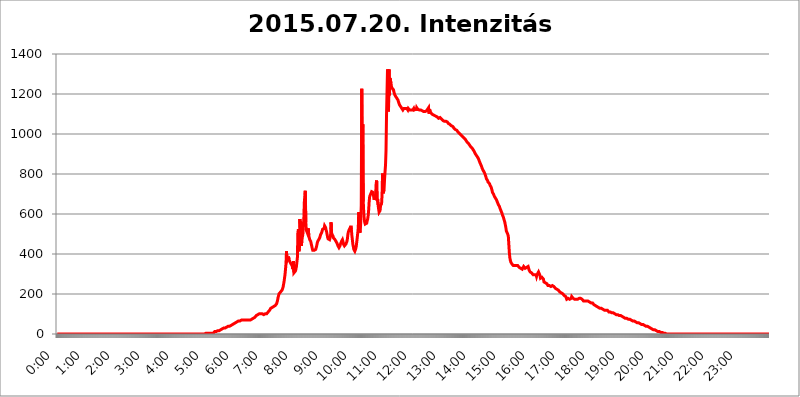
| Category | 2015.07.20. Intenzitás [W/m^2] |
|---|---|
| 0.0 | 0 |
| 0.0006944444444444445 | 0 |
| 0.001388888888888889 | 0 |
| 0.0020833333333333333 | 0 |
| 0.002777777777777778 | 0 |
| 0.003472222222222222 | 0 |
| 0.004166666666666667 | 0 |
| 0.004861111111111111 | 0 |
| 0.005555555555555556 | 0 |
| 0.0062499999999999995 | 0 |
| 0.006944444444444444 | 0 |
| 0.007638888888888889 | 0 |
| 0.008333333333333333 | 0 |
| 0.009027777777777779 | 0 |
| 0.009722222222222222 | 0 |
| 0.010416666666666666 | 0 |
| 0.011111111111111112 | 0 |
| 0.011805555555555555 | 0 |
| 0.012499999999999999 | 0 |
| 0.013194444444444444 | 0 |
| 0.013888888888888888 | 0 |
| 0.014583333333333332 | 0 |
| 0.015277777777777777 | 0 |
| 0.015972222222222224 | 0 |
| 0.016666666666666666 | 0 |
| 0.017361111111111112 | 0 |
| 0.018055555555555557 | 0 |
| 0.01875 | 0 |
| 0.019444444444444445 | 0 |
| 0.02013888888888889 | 0 |
| 0.020833333333333332 | 0 |
| 0.02152777777777778 | 0 |
| 0.022222222222222223 | 0 |
| 0.02291666666666667 | 0 |
| 0.02361111111111111 | 0 |
| 0.024305555555555556 | 0 |
| 0.024999999999999998 | 0 |
| 0.025694444444444447 | 0 |
| 0.02638888888888889 | 0 |
| 0.027083333333333334 | 0 |
| 0.027777777777777776 | 0 |
| 0.02847222222222222 | 0 |
| 0.029166666666666664 | 0 |
| 0.029861111111111113 | 0 |
| 0.030555555555555555 | 0 |
| 0.03125 | 0 |
| 0.03194444444444445 | 0 |
| 0.03263888888888889 | 0 |
| 0.03333333333333333 | 0 |
| 0.034027777777777775 | 0 |
| 0.034722222222222224 | 0 |
| 0.035416666666666666 | 0 |
| 0.036111111111111115 | 0 |
| 0.03680555555555556 | 0 |
| 0.0375 | 0 |
| 0.03819444444444444 | 0 |
| 0.03888888888888889 | 0 |
| 0.03958333333333333 | 0 |
| 0.04027777777777778 | 0 |
| 0.04097222222222222 | 0 |
| 0.041666666666666664 | 0 |
| 0.042361111111111106 | 0 |
| 0.04305555555555556 | 0 |
| 0.043750000000000004 | 0 |
| 0.044444444444444446 | 0 |
| 0.04513888888888889 | 0 |
| 0.04583333333333334 | 0 |
| 0.04652777777777778 | 0 |
| 0.04722222222222222 | 0 |
| 0.04791666666666666 | 0 |
| 0.04861111111111111 | 0 |
| 0.049305555555555554 | 0 |
| 0.049999999999999996 | 0 |
| 0.05069444444444445 | 0 |
| 0.051388888888888894 | 0 |
| 0.052083333333333336 | 0 |
| 0.05277777777777778 | 0 |
| 0.05347222222222222 | 0 |
| 0.05416666666666667 | 0 |
| 0.05486111111111111 | 0 |
| 0.05555555555555555 | 0 |
| 0.05625 | 0 |
| 0.05694444444444444 | 0 |
| 0.057638888888888885 | 0 |
| 0.05833333333333333 | 0 |
| 0.05902777777777778 | 0 |
| 0.059722222222222225 | 0 |
| 0.06041666666666667 | 0 |
| 0.061111111111111116 | 0 |
| 0.06180555555555556 | 0 |
| 0.0625 | 0 |
| 0.06319444444444444 | 0 |
| 0.06388888888888888 | 0 |
| 0.06458333333333334 | 0 |
| 0.06527777777777778 | 0 |
| 0.06597222222222222 | 0 |
| 0.06666666666666667 | 0 |
| 0.06736111111111111 | 0 |
| 0.06805555555555555 | 0 |
| 0.06874999999999999 | 0 |
| 0.06944444444444443 | 0 |
| 0.07013888888888889 | 0 |
| 0.07083333333333333 | 0 |
| 0.07152777777777779 | 0 |
| 0.07222222222222223 | 0 |
| 0.07291666666666667 | 0 |
| 0.07361111111111111 | 0 |
| 0.07430555555555556 | 0 |
| 0.075 | 0 |
| 0.07569444444444444 | 0 |
| 0.0763888888888889 | 0 |
| 0.07708333333333334 | 0 |
| 0.07777777777777778 | 0 |
| 0.07847222222222222 | 0 |
| 0.07916666666666666 | 0 |
| 0.0798611111111111 | 0 |
| 0.08055555555555556 | 0 |
| 0.08125 | 0 |
| 0.08194444444444444 | 0 |
| 0.08263888888888889 | 0 |
| 0.08333333333333333 | 0 |
| 0.08402777777777777 | 0 |
| 0.08472222222222221 | 0 |
| 0.08541666666666665 | 0 |
| 0.08611111111111112 | 0 |
| 0.08680555555555557 | 0 |
| 0.08750000000000001 | 0 |
| 0.08819444444444445 | 0 |
| 0.08888888888888889 | 0 |
| 0.08958333333333333 | 0 |
| 0.09027777777777778 | 0 |
| 0.09097222222222222 | 0 |
| 0.09166666666666667 | 0 |
| 0.09236111111111112 | 0 |
| 0.09305555555555556 | 0 |
| 0.09375 | 0 |
| 0.09444444444444444 | 0 |
| 0.09513888888888888 | 0 |
| 0.09583333333333333 | 0 |
| 0.09652777777777777 | 0 |
| 0.09722222222222222 | 0 |
| 0.09791666666666667 | 0 |
| 0.09861111111111111 | 0 |
| 0.09930555555555555 | 0 |
| 0.09999999999999999 | 0 |
| 0.10069444444444443 | 0 |
| 0.1013888888888889 | 0 |
| 0.10208333333333335 | 0 |
| 0.10277777777777779 | 0 |
| 0.10347222222222223 | 0 |
| 0.10416666666666667 | 0 |
| 0.10486111111111111 | 0 |
| 0.10555555555555556 | 0 |
| 0.10625 | 0 |
| 0.10694444444444444 | 0 |
| 0.1076388888888889 | 0 |
| 0.10833333333333334 | 0 |
| 0.10902777777777778 | 0 |
| 0.10972222222222222 | 0 |
| 0.1111111111111111 | 0 |
| 0.11180555555555556 | 0 |
| 0.11180555555555556 | 0 |
| 0.1125 | 0 |
| 0.11319444444444444 | 0 |
| 0.11388888888888889 | 0 |
| 0.11458333333333333 | 0 |
| 0.11527777777777777 | 0 |
| 0.11597222222222221 | 0 |
| 0.11666666666666665 | 0 |
| 0.1173611111111111 | 0 |
| 0.11805555555555557 | 0 |
| 0.11944444444444445 | 0 |
| 0.12013888888888889 | 0 |
| 0.12083333333333333 | 0 |
| 0.12152777777777778 | 0 |
| 0.12222222222222223 | 0 |
| 0.12291666666666667 | 0 |
| 0.12291666666666667 | 0 |
| 0.12361111111111112 | 0 |
| 0.12430555555555556 | 0 |
| 0.125 | 0 |
| 0.12569444444444444 | 0 |
| 0.12638888888888888 | 0 |
| 0.12708333333333333 | 0 |
| 0.16875 | 0 |
| 0.12847222222222224 | 0 |
| 0.12916666666666668 | 0 |
| 0.12986111111111112 | 0 |
| 0.13055555555555556 | 0 |
| 0.13125 | 0 |
| 0.13194444444444445 | 0 |
| 0.1326388888888889 | 0 |
| 0.13333333333333333 | 0 |
| 0.13402777777777777 | 0 |
| 0.13402777777777777 | 0 |
| 0.13472222222222222 | 0 |
| 0.13541666666666666 | 0 |
| 0.1361111111111111 | 0 |
| 0.13749999999999998 | 0 |
| 0.13819444444444443 | 0 |
| 0.1388888888888889 | 0 |
| 0.13958333333333334 | 0 |
| 0.14027777777777778 | 0 |
| 0.14097222222222222 | 0 |
| 0.14166666666666666 | 0 |
| 0.1423611111111111 | 0 |
| 0.14305555555555557 | 0 |
| 0.14375000000000002 | 0 |
| 0.14444444444444446 | 0 |
| 0.1451388888888889 | 0 |
| 0.1451388888888889 | 0 |
| 0.14652777777777778 | 0 |
| 0.14722222222222223 | 0 |
| 0.14791666666666667 | 0 |
| 0.1486111111111111 | 0 |
| 0.14930555555555555 | 0 |
| 0.15 | 0 |
| 0.15069444444444444 | 0 |
| 0.15138888888888888 | 0 |
| 0.15208333333333332 | 0 |
| 0.15277777777777776 | 0 |
| 0.15347222222222223 | 0 |
| 0.15416666666666667 | 0 |
| 0.15486111111111112 | 0 |
| 0.15555555555555556 | 0 |
| 0.15625 | 0 |
| 0.15694444444444444 | 0 |
| 0.15763888888888888 | 0 |
| 0.15833333333333333 | 0 |
| 0.15902777777777777 | 0 |
| 0.15972222222222224 | 0 |
| 0.16041666666666668 | 0 |
| 0.16111111111111112 | 0 |
| 0.16180555555555556 | 0 |
| 0.1625 | 0 |
| 0.16319444444444445 | 0 |
| 0.1638888888888889 | 0 |
| 0.16458333333333333 | 0 |
| 0.16527777777777777 | 0 |
| 0.16597222222222222 | 0 |
| 0.16666666666666666 | 0 |
| 0.1673611111111111 | 0 |
| 0.16805555555555554 | 0 |
| 0.16874999999999998 | 0 |
| 0.16944444444444443 | 0 |
| 0.17013888888888887 | 0 |
| 0.1708333333333333 | 0 |
| 0.17152777777777775 | 0 |
| 0.17222222222222225 | 0 |
| 0.1729166666666667 | 0 |
| 0.17361111111111113 | 0 |
| 0.17430555555555557 | 0 |
| 0.17500000000000002 | 0 |
| 0.17569444444444446 | 0 |
| 0.1763888888888889 | 0 |
| 0.17708333333333334 | 0 |
| 0.17777777777777778 | 0 |
| 0.17847222222222223 | 0 |
| 0.17916666666666667 | 0 |
| 0.1798611111111111 | 0 |
| 0.18055555555555555 | 0 |
| 0.18125 | 0 |
| 0.18194444444444444 | 0 |
| 0.1826388888888889 | 0 |
| 0.18333333333333335 | 0 |
| 0.1840277777777778 | 0 |
| 0.18472222222222223 | 0 |
| 0.18541666666666667 | 0 |
| 0.18611111111111112 | 0 |
| 0.18680555555555556 | 0 |
| 0.1875 | 0 |
| 0.18819444444444444 | 0 |
| 0.18888888888888888 | 0 |
| 0.18958333333333333 | 0 |
| 0.19027777777777777 | 0 |
| 0.1909722222222222 | 0 |
| 0.19166666666666665 | 0 |
| 0.19236111111111112 | 0 |
| 0.19305555555555554 | 0 |
| 0.19375 | 0 |
| 0.19444444444444445 | 0 |
| 0.1951388888888889 | 0 |
| 0.19583333333333333 | 0 |
| 0.19652777777777777 | 0 |
| 0.19722222222222222 | 0 |
| 0.19791666666666666 | 0 |
| 0.1986111111111111 | 0 |
| 0.19930555555555554 | 0 |
| 0.19999999999999998 | 0 |
| 0.20069444444444443 | 0 |
| 0.20138888888888887 | 0 |
| 0.2020833333333333 | 0 |
| 0.2027777777777778 | 0 |
| 0.2034722222222222 | 0 |
| 0.2041666666666667 | 0 |
| 0.20486111111111113 | 0 |
| 0.20555555555555557 | 0 |
| 0.20625000000000002 | 0 |
| 0.20694444444444446 | 0 |
| 0.2076388888888889 | 0 |
| 0.20833333333333334 | 3.525 |
| 0.20902777777777778 | 0 |
| 0.20972222222222223 | 3.525 |
| 0.21041666666666667 | 3.525 |
| 0.2111111111111111 | 3.525 |
| 0.21180555555555555 | 3.525 |
| 0.2125 | 3.525 |
| 0.21319444444444444 | 3.525 |
| 0.2138888888888889 | 3.525 |
| 0.21458333333333335 | 3.525 |
| 0.2152777777777778 | 3.525 |
| 0.21597222222222223 | 3.525 |
| 0.21666666666666667 | 3.525 |
| 0.21736111111111112 | 3.525 |
| 0.21805555555555556 | 3.525 |
| 0.21875 | 3.525 |
| 0.21944444444444444 | 7.887 |
| 0.22013888888888888 | 7.887 |
| 0.22083333333333333 | 12.257 |
| 0.22152777777777777 | 12.257 |
| 0.2222222222222222 | 12.257 |
| 0.22291666666666665 | 12.257 |
| 0.2236111111111111 | 12.257 |
| 0.22430555555555556 | 16.636 |
| 0.225 | 16.636 |
| 0.22569444444444445 | 16.636 |
| 0.2263888888888889 | 16.636 |
| 0.22708333333333333 | 16.636 |
| 0.22777777777777777 | 21.024 |
| 0.22847222222222222 | 21.024 |
| 0.22916666666666666 | 21.024 |
| 0.2298611111111111 | 21.024 |
| 0.23055555555555554 | 21.024 |
| 0.23124999999999998 | 25.419 |
| 0.23194444444444443 | 25.419 |
| 0.23263888888888887 | 29.823 |
| 0.2333333333333333 | 29.823 |
| 0.2340277777777778 | 29.823 |
| 0.2347222222222222 | 29.823 |
| 0.2354166666666667 | 29.823 |
| 0.23611111111111113 | 29.823 |
| 0.23680555555555557 | 29.823 |
| 0.23750000000000002 | 34.234 |
| 0.23819444444444446 | 34.234 |
| 0.2388888888888889 | 34.234 |
| 0.23958333333333334 | 38.653 |
| 0.24027777777777778 | 38.653 |
| 0.24097222222222223 | 38.653 |
| 0.24166666666666667 | 38.653 |
| 0.2423611111111111 | 43.079 |
| 0.24305555555555555 | 43.079 |
| 0.24375 | 43.079 |
| 0.24444444444444446 | 47.511 |
| 0.24513888888888888 | 47.511 |
| 0.24583333333333335 | 47.511 |
| 0.2465277777777778 | 51.951 |
| 0.24722222222222223 | 51.951 |
| 0.24791666666666667 | 51.951 |
| 0.24861111111111112 | 56.398 |
| 0.24930555555555556 | 56.398 |
| 0.25 | 56.398 |
| 0.25069444444444444 | 60.85 |
| 0.2513888888888889 | 60.85 |
| 0.2520833333333333 | 60.85 |
| 0.25277777777777777 | 60.85 |
| 0.2534722222222222 | 65.31 |
| 0.25416666666666665 | 65.31 |
| 0.2548611111111111 | 65.31 |
| 0.2555555555555556 | 65.31 |
| 0.25625000000000003 | 65.31 |
| 0.2569444444444445 | 69.775 |
| 0.2576388888888889 | 69.775 |
| 0.25833333333333336 | 69.775 |
| 0.2590277777777778 | 69.775 |
| 0.25972222222222224 | 69.775 |
| 0.2604166666666667 | 69.775 |
| 0.2611111111111111 | 69.775 |
| 0.26180555555555557 | 69.775 |
| 0.2625 | 69.775 |
| 0.26319444444444445 | 69.775 |
| 0.2638888888888889 | 69.775 |
| 0.26458333333333334 | 69.775 |
| 0.2652777777777778 | 69.775 |
| 0.2659722222222222 | 69.775 |
| 0.26666666666666666 | 69.775 |
| 0.2673611111111111 | 69.775 |
| 0.26805555555555555 | 69.775 |
| 0.26875 | 69.775 |
| 0.26944444444444443 | 69.775 |
| 0.2701388888888889 | 69.775 |
| 0.2708333333333333 | 69.775 |
| 0.27152777777777776 | 69.775 |
| 0.2722222222222222 | 74.246 |
| 0.27291666666666664 | 74.246 |
| 0.2736111111111111 | 74.246 |
| 0.2743055555555555 | 74.246 |
| 0.27499999999999997 | 78.722 |
| 0.27569444444444446 | 83.205 |
| 0.27638888888888885 | 83.205 |
| 0.27708333333333335 | 83.205 |
| 0.2777777777777778 | 87.692 |
| 0.27847222222222223 | 87.692 |
| 0.2791666666666667 | 92.184 |
| 0.2798611111111111 | 92.184 |
| 0.28055555555555556 | 96.682 |
| 0.28125 | 96.682 |
| 0.28194444444444444 | 96.682 |
| 0.2826388888888889 | 101.184 |
| 0.2833333333333333 | 101.184 |
| 0.28402777777777777 | 101.184 |
| 0.2847222222222222 | 101.184 |
| 0.28541666666666665 | 101.184 |
| 0.28611111111111115 | 101.184 |
| 0.28680555555555554 | 101.184 |
| 0.28750000000000003 | 101.184 |
| 0.2881944444444445 | 101.184 |
| 0.2888888888888889 | 101.184 |
| 0.28958333333333336 | 96.682 |
| 0.2902777777777778 | 96.682 |
| 0.29097222222222224 | 101.184 |
| 0.2916666666666667 | 101.184 |
| 0.2923611111111111 | 101.184 |
| 0.29305555555555557 | 101.184 |
| 0.29375 | 101.184 |
| 0.29444444444444445 | 101.184 |
| 0.2951388888888889 | 105.69 |
| 0.29583333333333334 | 110.201 |
| 0.2965277777777778 | 110.201 |
| 0.2972222222222222 | 114.716 |
| 0.29791666666666666 | 119.235 |
| 0.2986111111111111 | 123.758 |
| 0.29930555555555555 | 128.284 |
| 0.3 | 128.284 |
| 0.30069444444444443 | 128.284 |
| 0.3013888888888889 | 132.814 |
| 0.3020833333333333 | 132.814 |
| 0.30277777777777776 | 132.814 |
| 0.3034722222222222 | 137.347 |
| 0.30416666666666664 | 137.347 |
| 0.3048611111111111 | 137.347 |
| 0.3055555555555555 | 141.884 |
| 0.30624999999999997 | 141.884 |
| 0.3069444444444444 | 146.423 |
| 0.3076388888888889 | 150.964 |
| 0.30833333333333335 | 160.056 |
| 0.3090277777777778 | 169.156 |
| 0.30972222222222223 | 182.82 |
| 0.3104166666666667 | 191.937 |
| 0.3111111111111111 | 201.058 |
| 0.31180555555555556 | 201.058 |
| 0.3125 | 205.62 |
| 0.31319444444444444 | 210.182 |
| 0.3138888888888889 | 210.182 |
| 0.3145833333333333 | 214.746 |
| 0.31527777777777777 | 219.309 |
| 0.3159722222222222 | 223.873 |
| 0.31666666666666665 | 233 |
| 0.31736111111111115 | 246.689 |
| 0.31805555555555554 | 260.373 |
| 0.31875000000000003 | 278.603 |
| 0.3194444444444445 | 296.808 |
| 0.3201388888888889 | 324.052 |
| 0.32083333333333336 | 351.198 |
| 0.3215277777777778 | 414.035 |
| 0.32222222222222224 | 364.728 |
| 0.3229166666666667 | 369.23 |
| 0.3236111111111111 | 373.729 |
| 0.32430555555555557 | 387.202 |
| 0.325 | 373.729 |
| 0.32569444444444445 | 369.23 |
| 0.3263888888888889 | 360.221 |
| 0.32708333333333334 | 355.712 |
| 0.3277777777777778 | 351.198 |
| 0.3284722222222222 | 346.682 |
| 0.32916666666666666 | 342.162 |
| 0.3298611111111111 | 351.198 |
| 0.33055555555555555 | 324.052 |
| 0.33125 | 364.728 |
| 0.33194444444444443 | 305.898 |
| 0.3326388888888889 | 305.898 |
| 0.3333333333333333 | 305.898 |
| 0.3340277777777778 | 314.98 |
| 0.3347222222222222 | 324.052 |
| 0.3354166666666667 | 337.639 |
| 0.3361111111111111 | 360.221 |
| 0.3368055555555556 | 382.715 |
| 0.33749999999999997 | 506.542 |
| 0.33819444444444446 | 523.88 |
| 0.33888888888888885 | 414.035 |
| 0.33958333333333335 | 427.39 |
| 0.34027777777777773 | 575.299 |
| 0.34097222222222223 | 532.513 |
| 0.3416666666666666 | 562.53 |
| 0.3423611111111111 | 440.702 |
| 0.3430555555555555 | 467.187 |
| 0.34375 | 484.735 |
| 0.3444444444444445 | 497.836 |
| 0.3451388888888889 | 532.513 |
| 0.3458333333333334 | 575.299 |
| 0.34652777777777777 | 658.909 |
| 0.34722222222222227 | 658.909 |
| 0.34791666666666665 | 715.858 |
| 0.34861111111111115 | 558.261 |
| 0.34930555555555554 | 519.555 |
| 0.35000000000000003 | 515.223 |
| 0.3506944444444444 | 506.542 |
| 0.3513888888888889 | 502.192 |
| 0.3520833333333333 | 528.2 |
| 0.3527777777777778 | 493.475 |
| 0.3534722222222222 | 480.356 |
| 0.3541666666666667 | 471.582 |
| 0.3548611111111111 | 471.582 |
| 0.35555555555555557 | 462.786 |
| 0.35625 | 449.551 |
| 0.35694444444444445 | 440.702 |
| 0.3576388888888889 | 427.39 |
| 0.35833333333333334 | 418.492 |
| 0.3590277777777778 | 418.492 |
| 0.3597222222222222 | 418.492 |
| 0.36041666666666666 | 418.492 |
| 0.3611111111111111 | 414.035 |
| 0.36180555555555555 | 418.492 |
| 0.3625 | 422.943 |
| 0.36319444444444443 | 431.833 |
| 0.3638888888888889 | 440.702 |
| 0.3645833333333333 | 453.968 |
| 0.3652777777777778 | 462.786 |
| 0.3659722222222222 | 467.187 |
| 0.3666666666666667 | 471.582 |
| 0.3673611111111111 | 471.582 |
| 0.3680555555555556 | 480.356 |
| 0.36874999999999997 | 489.108 |
| 0.36944444444444446 | 497.836 |
| 0.37013888888888885 | 502.192 |
| 0.37083333333333335 | 506.542 |
| 0.37152777777777773 | 515.223 |
| 0.37222222222222223 | 523.88 |
| 0.3729166666666666 | 523.88 |
| 0.3736111111111111 | 523.88 |
| 0.3743055555555555 | 528.2 |
| 0.375 | 541.121 |
| 0.3756944444444445 | 541.121 |
| 0.3763888888888889 | 532.513 |
| 0.3770833333333334 | 519.555 |
| 0.37777777777777777 | 510.885 |
| 0.37847222222222227 | 497.836 |
| 0.37916666666666665 | 484.735 |
| 0.37986111111111115 | 475.972 |
| 0.38055555555555554 | 475.972 |
| 0.38125000000000003 | 471.582 |
| 0.3819444444444444 | 471.582 |
| 0.3826388888888889 | 480.356 |
| 0.3833333333333333 | 489.108 |
| 0.3840277777777778 | 558.261 |
| 0.3847222222222222 | 506.542 |
| 0.3854166666666667 | 497.836 |
| 0.3861111111111111 | 502.192 |
| 0.38680555555555557 | 489.108 |
| 0.3875 | 480.356 |
| 0.38819444444444445 | 480.356 |
| 0.3888888888888889 | 475.972 |
| 0.38958333333333334 | 471.582 |
| 0.3902777777777778 | 467.187 |
| 0.3909722222222222 | 462.786 |
| 0.39166666666666666 | 458.38 |
| 0.3923611111111111 | 453.968 |
| 0.39305555555555555 | 449.551 |
| 0.39375 | 440.702 |
| 0.39444444444444443 | 436.27 |
| 0.3951388888888889 | 431.833 |
| 0.3958333333333333 | 436.27 |
| 0.3965277777777778 | 440.702 |
| 0.3972222222222222 | 449.551 |
| 0.3979166666666667 | 453.968 |
| 0.3986111111111111 | 462.786 |
| 0.3993055555555556 | 467.187 |
| 0.39999999999999997 | 471.582 |
| 0.40069444444444446 | 462.786 |
| 0.40138888888888885 | 449.551 |
| 0.40208333333333335 | 445.129 |
| 0.40277777777777773 | 440.702 |
| 0.40347222222222223 | 440.702 |
| 0.4041666666666666 | 445.129 |
| 0.4048611111111111 | 449.551 |
| 0.4055555555555555 | 453.968 |
| 0.40625 | 462.786 |
| 0.4069444444444445 | 475.972 |
| 0.4076388888888889 | 497.836 |
| 0.4083333333333334 | 510.885 |
| 0.40902777777777777 | 515.223 |
| 0.40972222222222227 | 523.88 |
| 0.41041666666666665 | 528.2 |
| 0.41111111111111115 | 532.513 |
| 0.41180555555555554 | 541.121 |
| 0.41250000000000003 | 523.88 |
| 0.4131944444444444 | 493.475 |
| 0.4138888888888889 | 471.582 |
| 0.4145833333333333 | 449.551 |
| 0.4152777777777778 | 436.27 |
| 0.4159722222222222 | 422.943 |
| 0.4166666666666667 | 418.492 |
| 0.4173611111111111 | 414.035 |
| 0.41805555555555557 | 418.492 |
| 0.41875 | 427.39 |
| 0.41944444444444445 | 440.702 |
| 0.4201388888888889 | 462.786 |
| 0.42083333333333334 | 484.735 |
| 0.4215277777777778 | 506.542 |
| 0.4222222222222222 | 532.513 |
| 0.42291666666666666 | 609.062 |
| 0.4236111111111111 | 549.704 |
| 0.42430555555555555 | 506.542 |
| 0.425 | 515.223 |
| 0.42569444444444443 | 562.53 |
| 0.4263888888888889 | 642.4 |
| 0.4270833333333333 | 1225.859 |
| 0.4277777777777778 | 771.559 |
| 0.4284722222222222 | 1048.508 |
| 0.4291666666666667 | 663.019 |
| 0.4298611111111111 | 609.062 |
| 0.4305555555555556 | 575.299 |
| 0.43124999999999997 | 558.261 |
| 0.43194444444444446 | 549.704 |
| 0.43263888888888885 | 545.416 |
| 0.43333333333333335 | 545.416 |
| 0.43402777777777773 | 553.986 |
| 0.43472222222222223 | 566.793 |
| 0.4354166666666666 | 575.299 |
| 0.4361111111111111 | 592.233 |
| 0.4368055555555555 | 621.613 |
| 0.4375 | 663.019 |
| 0.4381944444444445 | 687.544 |
| 0.4388888888888889 | 691.608 |
| 0.4395833333333334 | 699.717 |
| 0.44027777777777777 | 703.762 |
| 0.44097222222222227 | 711.832 |
| 0.44166666666666665 | 707.8 |
| 0.44236111111111115 | 711.832 |
| 0.44305555555555554 | 707.8 |
| 0.44375000000000003 | 687.544 |
| 0.4444444444444444 | 671.22 |
| 0.4451388888888889 | 667.123 |
| 0.4458333333333333 | 675.311 |
| 0.4465277777777778 | 695.666 |
| 0.4472222222222222 | 747.834 |
| 0.4479166666666667 | 767.62 |
| 0.4486111111111111 | 667.123 |
| 0.44930555555555557 | 675.311 |
| 0.45 | 646.537 |
| 0.45069444444444445 | 625.784 |
| 0.4513888888888889 | 609.062 |
| 0.45208333333333334 | 604.864 |
| 0.4527777777777778 | 617.436 |
| 0.4534722222222222 | 642.4 |
| 0.45416666666666666 | 638.256 |
| 0.4548611111111111 | 650.667 |
| 0.45555555555555555 | 695.666 |
| 0.45625 | 802.868 |
| 0.45694444444444443 | 703.762 |
| 0.4576388888888889 | 707.8 |
| 0.4583333333333333 | 719.877 |
| 0.4590277777777778 | 771.559 |
| 0.4597222222222222 | 810.641 |
| 0.4604166666666667 | 845.365 |
| 0.4611111111111111 | 917.534 |
| 0.4618055555555556 | 1089.873 |
| 0.46249999999999997 | 1089.873 |
| 0.46319444444444446 | 1322.082 |
| 0.46388888888888885 | 1158.689 |
| 0.46458333333333335 | 1112.618 |
| 0.46527777777777773 | 1322.082 |
| 0.46597222222222223 | 1193.918 |
| 0.4666666666666666 | 1279.334 |
| 0.4673611111111111 | 1275.142 |
| 0.4680555555555555 | 1254.387 |
| 0.46875 | 1238.014 |
| 0.4694444444444445 | 1229.899 |
| 0.4701388888888889 | 1225.859 |
| 0.4708333333333334 | 1225.859 |
| 0.47152777777777777 | 1221.83 |
| 0.47222222222222227 | 1209.807 |
| 0.47291666666666665 | 1201.843 |
| 0.47361111111111115 | 1193.918 |
| 0.47430555555555554 | 1189.969 |
| 0.47500000000000003 | 1186.03 |
| 0.4756944444444444 | 1182.099 |
| 0.4763888888888889 | 1178.177 |
| 0.4770833333333333 | 1174.263 |
| 0.4777777777777778 | 1170.358 |
| 0.4784722222222222 | 1162.571 |
| 0.4791666666666667 | 1154.814 |
| 0.4798611111111111 | 1147.086 |
| 0.48055555555555557 | 1147.086 |
| 0.48125 | 1139.384 |
| 0.48194444444444445 | 1139.384 |
| 0.4826388888888889 | 1131.708 |
| 0.48333333333333334 | 1131.708 |
| 0.4840277777777778 | 1127.879 |
| 0.4847222222222222 | 1120.238 |
| 0.48541666666666666 | 1124.056 |
| 0.4861111111111111 | 1127.879 |
| 0.48680555555555555 | 1127.879 |
| 0.4875 | 1124.056 |
| 0.48819444444444443 | 1127.879 |
| 0.4888888888888889 | 1127.879 |
| 0.4895833333333333 | 1131.708 |
| 0.4902777777777778 | 1127.879 |
| 0.4909722222222222 | 1124.056 |
| 0.4916666666666667 | 1120.238 |
| 0.4923611111111111 | 1127.879 |
| 0.4930555555555556 | 1124.056 |
| 0.49374999999999997 | 1124.056 |
| 0.49444444444444446 | 1120.238 |
| 0.49513888888888885 | 1124.056 |
| 0.49583333333333335 | 1120.238 |
| 0.49652777777777773 | 1120.238 |
| 0.49722222222222223 | 1124.056 |
| 0.4979166666666666 | 1124.056 |
| 0.4986111111111111 | 1120.238 |
| 0.4993055555555555 | 1124.056 |
| 0.5 | 1127.879 |
| 0.5006944444444444 | 1120.238 |
| 0.5013888888888889 | 1124.056 |
| 0.5020833333333333 | 1124.056 |
| 0.5027777777777778 | 1124.056 |
| 0.5034722222222222 | 1116.426 |
| 0.5041666666666667 | 1131.708 |
| 0.5048611111111111 | 1127.879 |
| 0.5055555555555555 | 1124.056 |
| 0.50625 | 1124.056 |
| 0.5069444444444444 | 1120.238 |
| 0.5076388888888889 | 1120.238 |
| 0.5083333333333333 | 1120.238 |
| 0.5090277777777777 | 1116.426 |
| 0.5097222222222222 | 1120.238 |
| 0.5104166666666666 | 1116.426 |
| 0.5111111111111112 | 1116.426 |
| 0.5118055555555555 | 1116.426 |
| 0.5125000000000001 | 1112.618 |
| 0.5131944444444444 | 1112.618 |
| 0.513888888888889 | 1112.618 |
| 0.5145833333333333 | 1112.618 |
| 0.5152777777777778 | 1112.618 |
| 0.5159722222222222 | 1112.618 |
| 0.5166666666666667 | 1112.618 |
| 0.517361111111111 | 1112.618 |
| 0.5180555555555556 | 1116.426 |
| 0.5187499999999999 | 1120.238 |
| 0.5194444444444445 | 1124.056 |
| 0.5201388888888888 | 1124.056 |
| 0.5208333333333334 | 1131.708 |
| 0.5215277777777778 | 1101.226 |
| 0.5222222222222223 | 1124.056 |
| 0.5229166666666667 | 1112.618 |
| 0.5236111111111111 | 1108.816 |
| 0.5243055555555556 | 1105.019 |
| 0.525 | 1101.226 |
| 0.5256944444444445 | 1101.226 |
| 0.5263888888888889 | 1097.437 |
| 0.5270833333333333 | 1093.653 |
| 0.5277777777777778 | 1093.653 |
| 0.5284722222222222 | 1093.653 |
| 0.5291666666666667 | 1093.653 |
| 0.5298611111111111 | 1093.653 |
| 0.5305555555555556 | 1089.873 |
| 0.53125 | 1089.873 |
| 0.5319444444444444 | 1086.097 |
| 0.5326388888888889 | 1086.097 |
| 0.5333333333333333 | 1082.324 |
| 0.5340277777777778 | 1082.324 |
| 0.5347222222222222 | 1078.555 |
| 0.5354166666666667 | 1078.555 |
| 0.5361111111111111 | 1082.324 |
| 0.5368055555555555 | 1082.324 |
| 0.5375 | 1078.555 |
| 0.5381944444444444 | 1078.555 |
| 0.5388888888888889 | 1074.789 |
| 0.5395833333333333 | 1071.027 |
| 0.5402777777777777 | 1071.027 |
| 0.5409722222222222 | 1067.267 |
| 0.5416666666666666 | 1067.267 |
| 0.5423611111111112 | 1063.51 |
| 0.5430555555555555 | 1063.51 |
| 0.5437500000000001 | 1063.51 |
| 0.5444444444444444 | 1063.51 |
| 0.545138888888889 | 1063.51 |
| 0.5458333333333333 | 1063.51 |
| 0.5465277777777778 | 1063.51 |
| 0.5472222222222222 | 1059.756 |
| 0.5479166666666667 | 1056.004 |
| 0.548611111111111 | 1052.255 |
| 0.5493055555555556 | 1052.255 |
| 0.5499999999999999 | 1052.255 |
| 0.5506944444444445 | 1048.508 |
| 0.5513888888888888 | 1044.762 |
| 0.5520833333333334 | 1044.762 |
| 0.5527777777777778 | 1041.019 |
| 0.5534722222222223 | 1041.019 |
| 0.5541666666666667 | 1037.277 |
| 0.5548611111111111 | 1037.277 |
| 0.5555555555555556 | 1033.537 |
| 0.55625 | 1029.798 |
| 0.5569444444444445 | 1029.798 |
| 0.5576388888888889 | 1026.06 |
| 0.5583333333333333 | 1022.323 |
| 0.5590277777777778 | 1022.323 |
| 0.5597222222222222 | 1022.323 |
| 0.5604166666666667 | 1018.587 |
| 0.5611111111111111 | 1014.852 |
| 0.5618055555555556 | 1011.118 |
| 0.5625 | 1011.118 |
| 0.5631944444444444 | 1007.383 |
| 0.5638888888888889 | 1003.65 |
| 0.5645833333333333 | 999.916 |
| 0.5652777777777778 | 999.916 |
| 0.5659722222222222 | 996.182 |
| 0.5666666666666667 | 996.182 |
| 0.5673611111111111 | 992.448 |
| 0.5680555555555555 | 988.714 |
| 0.56875 | 988.714 |
| 0.5694444444444444 | 984.98 |
| 0.5701388888888889 | 981.244 |
| 0.5708333333333333 | 977.508 |
| 0.5715277777777777 | 977.508 |
| 0.5722222222222222 | 973.772 |
| 0.5729166666666666 | 970.034 |
| 0.5736111111111112 | 966.295 |
| 0.5743055555555555 | 962.555 |
| 0.5750000000000001 | 958.814 |
| 0.5756944444444444 | 955.071 |
| 0.576388888888889 | 955.071 |
| 0.5770833333333333 | 951.327 |
| 0.5777777777777778 | 947.58 |
| 0.5784722222222222 | 943.832 |
| 0.5791666666666667 | 940.082 |
| 0.579861111111111 | 936.33 |
| 0.5805555555555556 | 932.576 |
| 0.5812499999999999 | 932.576 |
| 0.5819444444444445 | 928.819 |
| 0.5826388888888888 | 925.06 |
| 0.5833333333333334 | 921.298 |
| 0.5840277777777778 | 917.534 |
| 0.5847222222222223 | 913.766 |
| 0.5854166666666667 | 909.996 |
| 0.5861111111111111 | 902.447 |
| 0.5868055555555556 | 898.668 |
| 0.5875 | 894.885 |
| 0.5881944444444445 | 894.885 |
| 0.5888888888888889 | 887.309 |
| 0.5895833333333333 | 887.309 |
| 0.5902777777777778 | 879.719 |
| 0.5909722222222222 | 875.918 |
| 0.5916666666666667 | 868.305 |
| 0.5923611111111111 | 860.676 |
| 0.5930555555555556 | 856.855 |
| 0.59375 | 849.199 |
| 0.5944444444444444 | 845.365 |
| 0.5951388888888889 | 837.682 |
| 0.5958333333333333 | 829.981 |
| 0.5965277777777778 | 826.123 |
| 0.5972222222222222 | 818.392 |
| 0.5979166666666667 | 814.519 |
| 0.5986111111111111 | 810.641 |
| 0.5993055555555555 | 806.757 |
| 0.6 | 798.974 |
| 0.6006944444444444 | 791.169 |
| 0.6013888888888889 | 783.342 |
| 0.6020833333333333 | 775.492 |
| 0.6027777777777777 | 771.559 |
| 0.6034722222222222 | 767.62 |
| 0.6041666666666666 | 759.723 |
| 0.6048611111111112 | 759.723 |
| 0.6055555555555555 | 755.766 |
| 0.6062500000000001 | 751.803 |
| 0.6069444444444444 | 743.859 |
| 0.607638888888889 | 739.877 |
| 0.6083333333333333 | 735.89 |
| 0.6090277777777778 | 727.896 |
| 0.6097222222222222 | 719.877 |
| 0.6104166666666667 | 707.8 |
| 0.611111111111111 | 707.8 |
| 0.6118055555555556 | 699.717 |
| 0.6124999999999999 | 695.666 |
| 0.6131944444444445 | 687.544 |
| 0.6138888888888888 | 683.473 |
| 0.6145833333333334 | 679.395 |
| 0.6152777777777778 | 675.311 |
| 0.6159722222222223 | 671.22 |
| 0.6166666666666667 | 667.123 |
| 0.6173611111111111 | 658.909 |
| 0.6180555555555556 | 654.791 |
| 0.61875 | 646.537 |
| 0.6194444444444445 | 642.4 |
| 0.6201388888888889 | 638.256 |
| 0.6208333333333333 | 629.948 |
| 0.6215277777777778 | 625.784 |
| 0.6222222222222222 | 617.436 |
| 0.6229166666666667 | 613.252 |
| 0.6236111111111111 | 604.864 |
| 0.6243055555555556 | 596.45 |
| 0.625 | 592.233 |
| 0.6256944444444444 | 583.779 |
| 0.6263888888888889 | 575.299 |
| 0.6270833333333333 | 566.793 |
| 0.6277777777777778 | 558.261 |
| 0.6284722222222222 | 545.416 |
| 0.6291666666666667 | 532.513 |
| 0.6298611111111111 | 515.223 |
| 0.6305555555555555 | 515.223 |
| 0.63125 | 515.223 |
| 0.6319444444444444 | 497.836 |
| 0.6326388888888889 | 489.108 |
| 0.6333333333333333 | 449.551 |
| 0.6340277777777777 | 409.574 |
| 0.6347222222222222 | 382.715 |
| 0.6354166666666666 | 369.23 |
| 0.6361111111111112 | 360.221 |
| 0.6368055555555555 | 355.712 |
| 0.6375000000000001 | 351.198 |
| 0.6381944444444444 | 346.682 |
| 0.638888888888889 | 346.682 |
| 0.6395833333333333 | 342.162 |
| 0.6402777777777778 | 342.162 |
| 0.6409722222222222 | 342.162 |
| 0.6416666666666667 | 342.162 |
| 0.642361111111111 | 342.162 |
| 0.6430555555555556 | 346.682 |
| 0.6437499999999999 | 342.162 |
| 0.6444444444444445 | 342.162 |
| 0.6451388888888888 | 342.162 |
| 0.6458333333333334 | 342.162 |
| 0.6465277777777778 | 337.639 |
| 0.6472222222222223 | 337.639 |
| 0.6479166666666667 | 333.113 |
| 0.6486111111111111 | 333.113 |
| 0.6493055555555556 | 328.584 |
| 0.65 | 328.584 |
| 0.6506944444444445 | 328.584 |
| 0.6513888888888889 | 324.052 |
| 0.6520833333333333 | 324.052 |
| 0.6527777777777778 | 319.517 |
| 0.6534722222222222 | 328.584 |
| 0.6541666666666667 | 337.639 |
| 0.6548611111111111 | 333.113 |
| 0.6555555555555556 | 333.113 |
| 0.65625 | 328.584 |
| 0.6569444444444444 | 324.052 |
| 0.6576388888888889 | 328.584 |
| 0.6583333333333333 | 333.113 |
| 0.6590277777777778 | 328.584 |
| 0.6597222222222222 | 333.113 |
| 0.6604166666666667 | 337.639 |
| 0.6611111111111111 | 333.113 |
| 0.6618055555555555 | 319.517 |
| 0.6625 | 319.517 |
| 0.6631944444444444 | 310.44 |
| 0.6638888888888889 | 310.44 |
| 0.6645833333333333 | 310.44 |
| 0.6652777777777777 | 305.898 |
| 0.6659722222222222 | 301.354 |
| 0.6666666666666666 | 301.354 |
| 0.6673611111111111 | 296.808 |
| 0.6680555555555556 | 296.808 |
| 0.6687500000000001 | 296.808 |
| 0.6694444444444444 | 296.808 |
| 0.6701388888888888 | 296.808 |
| 0.6708333333333334 | 296.808 |
| 0.6715277777777778 | 296.808 |
| 0.6722222222222222 | 287.709 |
| 0.6729166666666666 | 296.808 |
| 0.6736111111111112 | 292.259 |
| 0.6743055555555556 | 301.354 |
| 0.6749999999999999 | 310.44 |
| 0.6756944444444444 | 305.898 |
| 0.6763888888888889 | 305.898 |
| 0.6770833333333334 | 292.259 |
| 0.6777777777777777 | 278.603 |
| 0.6784722222222223 | 278.603 |
| 0.6791666666666667 | 278.603 |
| 0.6798611111111111 | 283.156 |
| 0.6805555555555555 | 283.156 |
| 0.68125 | 283.156 |
| 0.6819444444444445 | 274.047 |
| 0.6826388888888889 | 260.373 |
| 0.6833333333333332 | 260.373 |
| 0.6840277777777778 | 260.373 |
| 0.6847222222222222 | 255.813 |
| 0.6854166666666667 | 251.251 |
| 0.686111111111111 | 251.251 |
| 0.6868055555555556 | 251.251 |
| 0.6875 | 246.689 |
| 0.6881944444444444 | 242.127 |
| 0.688888888888889 | 242.127 |
| 0.6895833333333333 | 242.127 |
| 0.6902777777777778 | 242.127 |
| 0.6909722222222222 | 242.127 |
| 0.6916666666666668 | 237.564 |
| 0.6923611111111111 | 237.564 |
| 0.6930555555555555 | 237.564 |
| 0.69375 | 242.127 |
| 0.6944444444444445 | 242.127 |
| 0.6951388888888889 | 237.564 |
| 0.6958333333333333 | 237.564 |
| 0.6965277777777777 | 237.564 |
| 0.6972222222222223 | 233 |
| 0.6979166666666666 | 233 |
| 0.6986111111111111 | 228.436 |
| 0.6993055555555556 | 228.436 |
| 0.7000000000000001 | 223.873 |
| 0.7006944444444444 | 223.873 |
| 0.7013888888888888 | 223.873 |
| 0.7020833333333334 | 219.309 |
| 0.7027777777777778 | 219.309 |
| 0.7034722222222222 | 214.746 |
| 0.7041666666666666 | 214.746 |
| 0.7048611111111112 | 210.182 |
| 0.7055555555555556 | 210.182 |
| 0.7062499999999999 | 210.182 |
| 0.7069444444444444 | 205.62 |
| 0.7076388888888889 | 205.62 |
| 0.7083333333333334 | 201.058 |
| 0.7090277777777777 | 201.058 |
| 0.7097222222222223 | 196.497 |
| 0.7104166666666667 | 196.497 |
| 0.7111111111111111 | 191.937 |
| 0.7118055555555555 | 191.937 |
| 0.7125 | 187.378 |
| 0.7131944444444445 | 187.378 |
| 0.7138888888888889 | 182.82 |
| 0.7145833333333332 | 173.709 |
| 0.7152777777777778 | 178.264 |
| 0.7159722222222222 | 178.264 |
| 0.7166666666666667 | 178.264 |
| 0.717361111111111 | 178.264 |
| 0.7180555555555556 | 173.709 |
| 0.71875 | 173.709 |
| 0.7194444444444444 | 173.709 |
| 0.720138888888889 | 178.264 |
| 0.7208333333333333 | 178.264 |
| 0.7215277777777778 | 187.378 |
| 0.7222222222222222 | 191.937 |
| 0.7229166666666668 | 182.82 |
| 0.7236111111111111 | 178.264 |
| 0.7243055555555555 | 178.264 |
| 0.725 | 173.709 |
| 0.7256944444444445 | 173.709 |
| 0.7263888888888889 | 173.709 |
| 0.7270833333333333 | 173.709 |
| 0.7277777777777777 | 173.709 |
| 0.7284722222222223 | 173.709 |
| 0.7291666666666666 | 173.709 |
| 0.7298611111111111 | 173.709 |
| 0.7305555555555556 | 178.264 |
| 0.7312500000000001 | 178.264 |
| 0.7319444444444444 | 178.264 |
| 0.7326388888888888 | 178.264 |
| 0.7333333333333334 | 178.264 |
| 0.7340277777777778 | 178.264 |
| 0.7347222222222222 | 173.709 |
| 0.7354166666666666 | 173.709 |
| 0.7361111111111112 | 173.709 |
| 0.7368055555555556 | 169.156 |
| 0.7374999999999999 | 169.156 |
| 0.7381944444444444 | 164.605 |
| 0.7388888888888889 | 169.156 |
| 0.7395833333333334 | 164.605 |
| 0.7402777777777777 | 164.605 |
| 0.7409722222222223 | 164.605 |
| 0.7416666666666667 | 164.605 |
| 0.7423611111111111 | 164.605 |
| 0.7430555555555555 | 164.605 |
| 0.74375 | 164.605 |
| 0.7444444444444445 | 164.605 |
| 0.7451388888888889 | 160.056 |
| 0.7458333333333332 | 160.056 |
| 0.7465277777777778 | 160.056 |
| 0.7472222222222222 | 155.509 |
| 0.7479166666666667 | 155.509 |
| 0.748611111111111 | 155.509 |
| 0.7493055555555556 | 155.509 |
| 0.75 | 155.509 |
| 0.7506944444444444 | 155.509 |
| 0.751388888888889 | 150.964 |
| 0.7520833333333333 | 150.964 |
| 0.7527777777777778 | 146.423 |
| 0.7534722222222222 | 146.423 |
| 0.7541666666666668 | 146.423 |
| 0.7548611111111111 | 141.884 |
| 0.7555555555555555 | 141.884 |
| 0.75625 | 141.884 |
| 0.7569444444444445 | 137.347 |
| 0.7576388888888889 | 137.347 |
| 0.7583333333333333 | 137.347 |
| 0.7590277777777777 | 132.814 |
| 0.7597222222222223 | 132.814 |
| 0.7604166666666666 | 132.814 |
| 0.7611111111111111 | 128.284 |
| 0.7618055555555556 | 128.284 |
| 0.7625000000000001 | 128.284 |
| 0.7631944444444444 | 128.284 |
| 0.7638888888888888 | 128.284 |
| 0.7645833333333334 | 123.758 |
| 0.7652777777777778 | 123.758 |
| 0.7659722222222222 | 123.758 |
| 0.7666666666666666 | 123.758 |
| 0.7673611111111112 | 119.235 |
| 0.7680555555555556 | 119.235 |
| 0.7687499999999999 | 119.235 |
| 0.7694444444444444 | 119.235 |
| 0.7701388888888889 | 119.235 |
| 0.7708333333333334 | 123.758 |
| 0.7715277777777777 | 119.235 |
| 0.7722222222222223 | 114.716 |
| 0.7729166666666667 | 114.716 |
| 0.7736111111111111 | 110.201 |
| 0.7743055555555555 | 110.201 |
| 0.775 | 110.201 |
| 0.7756944444444445 | 110.201 |
| 0.7763888888888889 | 110.201 |
| 0.7770833333333332 | 105.69 |
| 0.7777777777777778 | 105.69 |
| 0.7784722222222222 | 105.69 |
| 0.7791666666666667 | 105.69 |
| 0.779861111111111 | 105.69 |
| 0.7805555555555556 | 101.184 |
| 0.78125 | 101.184 |
| 0.7819444444444444 | 101.184 |
| 0.782638888888889 | 101.184 |
| 0.7833333333333333 | 101.184 |
| 0.7840277777777778 | 96.682 |
| 0.7847222222222222 | 96.682 |
| 0.7854166666666668 | 96.682 |
| 0.7861111111111111 | 96.682 |
| 0.7868055555555555 | 92.184 |
| 0.7875 | 92.184 |
| 0.7881944444444445 | 92.184 |
| 0.7888888888888889 | 92.184 |
| 0.7895833333333333 | 92.184 |
| 0.7902777777777777 | 92.184 |
| 0.7909722222222223 | 87.692 |
| 0.7916666666666666 | 87.692 |
| 0.7923611111111111 | 87.692 |
| 0.7930555555555556 | 83.205 |
| 0.7937500000000001 | 83.205 |
| 0.7944444444444444 | 83.205 |
| 0.7951388888888888 | 83.205 |
| 0.7958333333333334 | 83.205 |
| 0.7965277777777778 | 78.722 |
| 0.7972222222222222 | 78.722 |
| 0.7979166666666666 | 78.722 |
| 0.7986111111111112 | 78.722 |
| 0.7993055555555556 | 74.246 |
| 0.7999999999999999 | 74.246 |
| 0.8006944444444444 | 74.246 |
| 0.8013888888888889 | 74.246 |
| 0.8020833333333334 | 74.246 |
| 0.8027777777777777 | 74.246 |
| 0.8034722222222223 | 74.246 |
| 0.8041666666666667 | 74.246 |
| 0.8048611111111111 | 69.775 |
| 0.8055555555555555 | 69.775 |
| 0.80625 | 69.775 |
| 0.8069444444444445 | 65.31 |
| 0.8076388888888889 | 65.31 |
| 0.8083333333333332 | 65.31 |
| 0.8090277777777778 | 65.31 |
| 0.8097222222222222 | 65.31 |
| 0.8104166666666667 | 60.85 |
| 0.811111111111111 | 60.85 |
| 0.8118055555555556 | 60.85 |
| 0.8125 | 60.85 |
| 0.8131944444444444 | 56.398 |
| 0.813888888888889 | 56.398 |
| 0.8145833333333333 | 56.398 |
| 0.8152777777777778 | 56.398 |
| 0.8159722222222222 | 56.398 |
| 0.8166666666666668 | 51.951 |
| 0.8173611111111111 | 51.951 |
| 0.8180555555555555 | 51.951 |
| 0.81875 | 51.951 |
| 0.8194444444444445 | 47.511 |
| 0.8201388888888889 | 47.511 |
| 0.8208333333333333 | 47.511 |
| 0.8215277777777777 | 47.511 |
| 0.8222222222222223 | 47.511 |
| 0.8229166666666666 | 47.511 |
| 0.8236111111111111 | 43.079 |
| 0.8243055555555556 | 43.079 |
| 0.8250000000000001 | 43.079 |
| 0.8256944444444444 | 38.653 |
| 0.8263888888888888 | 38.653 |
| 0.8270833333333334 | 38.653 |
| 0.8277777777777778 | 38.653 |
| 0.8284722222222222 | 34.234 |
| 0.8291666666666666 | 34.234 |
| 0.8298611111111112 | 34.234 |
| 0.8305555555555556 | 34.234 |
| 0.8312499999999999 | 29.823 |
| 0.8319444444444444 | 29.823 |
| 0.8326388888888889 | 29.823 |
| 0.8333333333333334 | 29.823 |
| 0.8340277777777777 | 25.419 |
| 0.8347222222222223 | 25.419 |
| 0.8354166666666667 | 25.419 |
| 0.8361111111111111 | 21.024 |
| 0.8368055555555555 | 21.024 |
| 0.8375 | 21.024 |
| 0.8381944444444445 | 21.024 |
| 0.8388888888888889 | 21.024 |
| 0.8395833333333332 | 16.636 |
| 0.8402777777777778 | 16.636 |
| 0.8409722222222222 | 16.636 |
| 0.8416666666666667 | 16.636 |
| 0.842361111111111 | 12.257 |
| 0.8430555555555556 | 12.257 |
| 0.84375 | 12.257 |
| 0.8444444444444444 | 12.257 |
| 0.845138888888889 | 7.887 |
| 0.8458333333333333 | 7.887 |
| 0.8465277777777778 | 7.887 |
| 0.8472222222222222 | 7.887 |
| 0.8479166666666668 | 7.887 |
| 0.8486111111111111 | 7.887 |
| 0.8493055555555555 | 3.525 |
| 0.85 | 3.525 |
| 0.8506944444444445 | 3.525 |
| 0.8513888888888889 | 3.525 |
| 0.8520833333333333 | 3.525 |
| 0.8527777777777777 | 3.525 |
| 0.8534722222222223 | 3.525 |
| 0.8541666666666666 | 3.525 |
| 0.8548611111111111 | 0 |
| 0.8555555555555556 | 0 |
| 0.8562500000000001 | 0 |
| 0.8569444444444444 | 0 |
| 0.8576388888888888 | 0 |
| 0.8583333333333334 | 0 |
| 0.8590277777777778 | 0 |
| 0.8597222222222222 | 0 |
| 0.8604166666666666 | 0 |
| 0.8611111111111112 | 0 |
| 0.8618055555555556 | 0 |
| 0.8624999999999999 | 0 |
| 0.8631944444444444 | 0 |
| 0.8638888888888889 | 0 |
| 0.8645833333333334 | 0 |
| 0.8652777777777777 | 0 |
| 0.8659722222222223 | 0 |
| 0.8666666666666667 | 0 |
| 0.8673611111111111 | 0 |
| 0.8680555555555555 | 0 |
| 0.86875 | 0 |
| 0.8694444444444445 | 0 |
| 0.8701388888888889 | 0 |
| 0.8708333333333332 | 0 |
| 0.8715277777777778 | 0 |
| 0.8722222222222222 | 0 |
| 0.8729166666666667 | 0 |
| 0.873611111111111 | 0 |
| 0.8743055555555556 | 0 |
| 0.875 | 0 |
| 0.8756944444444444 | 0 |
| 0.876388888888889 | 0 |
| 0.8770833333333333 | 0 |
| 0.8777777777777778 | 0 |
| 0.8784722222222222 | 0 |
| 0.8791666666666668 | 0 |
| 0.8798611111111111 | 0 |
| 0.8805555555555555 | 0 |
| 0.88125 | 0 |
| 0.8819444444444445 | 0 |
| 0.8826388888888889 | 0 |
| 0.8833333333333333 | 0 |
| 0.8840277777777777 | 0 |
| 0.8847222222222223 | 0 |
| 0.8854166666666666 | 0 |
| 0.8861111111111111 | 0 |
| 0.8868055555555556 | 0 |
| 0.8875000000000001 | 0 |
| 0.8881944444444444 | 0 |
| 0.8888888888888888 | 0 |
| 0.8895833333333334 | 0 |
| 0.8902777777777778 | 0 |
| 0.8909722222222222 | 0 |
| 0.8916666666666666 | 0 |
| 0.8923611111111112 | 0 |
| 0.8930555555555556 | 0 |
| 0.8937499999999999 | 0 |
| 0.8944444444444444 | 0 |
| 0.8951388888888889 | 0 |
| 0.8958333333333334 | 0 |
| 0.8965277777777777 | 0 |
| 0.8972222222222223 | 0 |
| 0.8979166666666667 | 0 |
| 0.8986111111111111 | 0 |
| 0.8993055555555555 | 0 |
| 0.9 | 0 |
| 0.9006944444444445 | 0 |
| 0.9013888888888889 | 0 |
| 0.9020833333333332 | 0 |
| 0.9027777777777778 | 0 |
| 0.9034722222222222 | 0 |
| 0.9041666666666667 | 0 |
| 0.904861111111111 | 0 |
| 0.9055555555555556 | 0 |
| 0.90625 | 0 |
| 0.9069444444444444 | 0 |
| 0.907638888888889 | 0 |
| 0.9083333333333333 | 0 |
| 0.9090277777777778 | 0 |
| 0.9097222222222222 | 0 |
| 0.9104166666666668 | 0 |
| 0.9111111111111111 | 0 |
| 0.9118055555555555 | 0 |
| 0.9125 | 0 |
| 0.9131944444444445 | 0 |
| 0.9138888888888889 | 0 |
| 0.9145833333333333 | 0 |
| 0.9152777777777777 | 0 |
| 0.9159722222222223 | 0 |
| 0.9166666666666666 | 0 |
| 0.9173611111111111 | 0 |
| 0.9180555555555556 | 0 |
| 0.9187500000000001 | 0 |
| 0.9194444444444444 | 0 |
| 0.9201388888888888 | 0 |
| 0.9208333333333334 | 0 |
| 0.9215277777777778 | 0 |
| 0.9222222222222222 | 0 |
| 0.9229166666666666 | 0 |
| 0.9236111111111112 | 0 |
| 0.9243055555555556 | 0 |
| 0.9249999999999999 | 0 |
| 0.9256944444444444 | 0 |
| 0.9263888888888889 | 0 |
| 0.9270833333333334 | 0 |
| 0.9277777777777777 | 0 |
| 0.9284722222222223 | 0 |
| 0.9291666666666667 | 0 |
| 0.9298611111111111 | 0 |
| 0.9305555555555555 | 0 |
| 0.93125 | 0 |
| 0.9319444444444445 | 0 |
| 0.9326388888888889 | 0 |
| 0.9333333333333332 | 0 |
| 0.9340277777777778 | 0 |
| 0.9347222222222222 | 0 |
| 0.9354166666666667 | 0 |
| 0.936111111111111 | 0 |
| 0.9368055555555556 | 0 |
| 0.9375 | 0 |
| 0.9381944444444444 | 0 |
| 0.938888888888889 | 0 |
| 0.9395833333333333 | 0 |
| 0.9402777777777778 | 0 |
| 0.9409722222222222 | 0 |
| 0.9416666666666668 | 0 |
| 0.9423611111111111 | 0 |
| 0.9430555555555555 | 0 |
| 0.94375 | 0 |
| 0.9444444444444445 | 0 |
| 0.9451388888888889 | 0 |
| 0.9458333333333333 | 0 |
| 0.9465277777777777 | 0 |
| 0.9472222222222223 | 0 |
| 0.9479166666666666 | 0 |
| 0.9486111111111111 | 0 |
| 0.9493055555555556 | 0 |
| 0.9500000000000001 | 0 |
| 0.9506944444444444 | 0 |
| 0.9513888888888888 | 0 |
| 0.9520833333333334 | 0 |
| 0.9527777777777778 | 0 |
| 0.9534722222222222 | 0 |
| 0.9541666666666666 | 0 |
| 0.9548611111111112 | 0 |
| 0.9555555555555556 | 0 |
| 0.9562499999999999 | 0 |
| 0.9569444444444444 | 0 |
| 0.9576388888888889 | 0 |
| 0.9583333333333334 | 0 |
| 0.9590277777777777 | 0 |
| 0.9597222222222223 | 0 |
| 0.9604166666666667 | 0 |
| 0.9611111111111111 | 0 |
| 0.9618055555555555 | 0 |
| 0.9625 | 0 |
| 0.9631944444444445 | 0 |
| 0.9638888888888889 | 0 |
| 0.9645833333333332 | 0 |
| 0.9652777777777778 | 0 |
| 0.9659722222222222 | 0 |
| 0.9666666666666667 | 0 |
| 0.967361111111111 | 0 |
| 0.9680555555555556 | 0 |
| 0.96875 | 0 |
| 0.9694444444444444 | 0 |
| 0.970138888888889 | 0 |
| 0.9708333333333333 | 0 |
| 0.9715277777777778 | 0 |
| 0.9722222222222222 | 0 |
| 0.9729166666666668 | 0 |
| 0.9736111111111111 | 0 |
| 0.9743055555555555 | 0 |
| 0.975 | 0 |
| 0.9756944444444445 | 0 |
| 0.9763888888888889 | 0 |
| 0.9770833333333333 | 0 |
| 0.9777777777777777 | 0 |
| 0.9784722222222223 | 0 |
| 0.9791666666666666 | 0 |
| 0.9798611111111111 | 0 |
| 0.9805555555555556 | 0 |
| 0.9812500000000001 | 0 |
| 0.9819444444444444 | 0 |
| 0.9826388888888888 | 0 |
| 0.9833333333333334 | 0 |
| 0.9840277777777778 | 0 |
| 0.9847222222222222 | 0 |
| 0.9854166666666666 | 0 |
| 0.9861111111111112 | 0 |
| 0.9868055555555556 | 0 |
| 0.9874999999999999 | 0 |
| 0.9881944444444444 | 0 |
| 0.9888888888888889 | 0 |
| 0.9895833333333334 | 0 |
| 0.9902777777777777 | 0 |
| 0.9909722222222223 | 0 |
| 0.9916666666666667 | 0 |
| 0.9923611111111111 | 0 |
| 0.9930555555555555 | 0 |
| 0.99375 | 0 |
| 0.9944444444444445 | 0 |
| 0.9951388888888889 | 0 |
| 0.9958333333333332 | 0 |
| 0.9965277777777778 | 0 |
| 0.9972222222222222 | 0 |
| 0.9979166666666667 | 0 |
| 0.998611111111111 | 0 |
| 0.9993055555555556 | 0 |